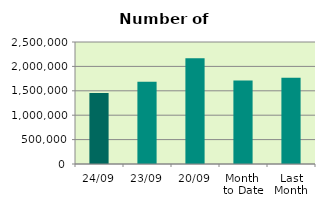
| Category | Series 0 |
|---|---|
| 24/09 | 1456254 |
| 23/09 | 1685220 |
| 20/09 | 2167704 |
| Month 
to Date | 1713118.706 |
| Last
Month | 1768562.909 |